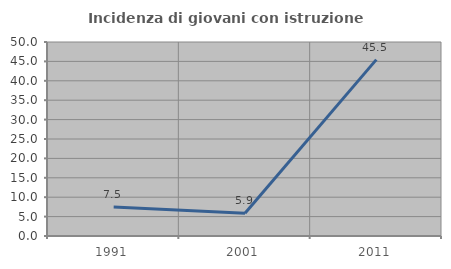
| Category | Incidenza di giovani con istruzione universitaria |
|---|---|
| 1991.0 | 7.5 |
| 2001.0 | 5.882 |
| 2011.0 | 45.455 |